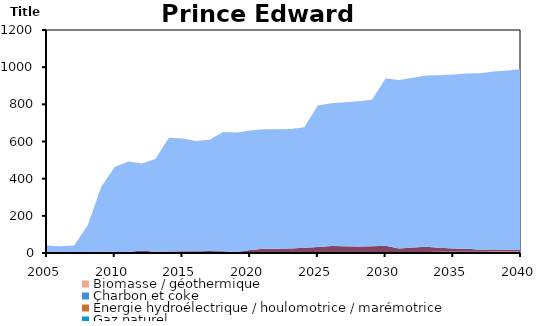
| Category | Biomasse / géothermique | Charbon et coke | Énergie hydroélectrique / houlomotrice / marémotrice | Gaz naturel | Pétrole | Solaire | Uranium | Éolien |
|---|---|---|---|---|---|---|---|---|
| 2005.0 | 0 | 0 | 0 | 0 | 0.879 | 0 | 0 | 40 |
| 2006.0 | 0 | 0 | 0 | 0 | 0.879 | 0 | 0 | 36 |
| 2007.0 | 0 | 0 | 0 | 0 | 0.879 | 0 | 0 | 40 |
| 2008.0 | 5 | 0 | 0 | 0 | 0.482 | 0 | 0 | 142 |
| 2009.0 | 5 | 0 | 0 | 0 | 2.721 | 0 | 0 | 347 |
| 2010.0 | 5 | 0 | 0 | 0 | 0 | 0 | 0 | 458 |
| 2011.0 | 5 | 0 | 0 | 0 | 0 | 0 | 0 | 488 |
| 2012.0 | 5 | 0 | 0 | 0 | 8.163 | 0 | 0 | 468 |
| 2013.0 | 5 | 0 | 0 | 0 | 2.168 | 0 | 0 | 499 |
| 2014.0 | 2.5 | 0 | 0 | 0 | 5.8 | 0 | 0 | 611.28 |
| 2015.0 | 2.6 | 0 | 0 | 0 | 7.3 | 0 | 0 | 606.094 |
| 2016.0 | 2.7 | 0 | 0 | 0 | 6.3 | 0 | 0 | 593.653 |
| 2017.0 | 2.7 | 0 | 0 | 0 | 8.1 | 0 | 0 | 598.312 |
| 2018.0 | 2.7 | 0 | 0 | 0 | 6.336 | 0 | 0 | 642.72 |
| 2019.0 | 2.7 | 0 | 0 | 0 | 3.155 | 0 | 0 | 642.72 |
| 2020.0 | 2.7 | 0 | 0 | 0 | 13.691 | 0 | 0 | 642.72 |
| 2021.0 | 2.7 | 0 | 0 | 0 | 20.118 | 0 | 0 | 642.72 |
| 2022.0 | 2.7 | 0 | 0 | 0 | 20.118 | 0 | 0 | 642.72 |
| 2023.0 | 2.7 | 0 | 0 | 0 | 22 | 0 | 0 | 642.72 |
| 2024.0 | 2.7 | 0 | 0 | 0 | 25 | 0 | 0 | 649.552 |
| 2025.0 | 2.7 | 0 | 0 | 0 | 30 | 0 | 0 | 761.33 |
| 2026.0 | 3.226 | 0 | 0 | 0 | 35 | 0 | 0 | 768.075 |
| 2027.0 | 3.751 | 0 | 0 | 0 | 33 | 0 | 0 | 774.82 |
| 2028.0 | 4.364 | 0 | 0 | 0 | 30 | 0 | 0 | 781.566 |
| 2029.0 | 4.89 | 0 | 0 | 0 | 31 | 0 | 0 | 788.398 |
| 2030.0 | 4.599 | 0 | 0 | 0 | 34 | 0 | 0 | 900.351 |
| 2031.0 | 5.027 | 0 | 0 | 0 | 19 | 0 | 0 | 907.272 |
| 2032.0 | 5.395 | 0 | 0 | 0 | 24 | 0 | 0 | 914.192 |
| 2033.0 | 5.824 | 0 | 0 | 0 | 28 | 0 | 0 | 921.288 |
| 2034.0 | 6.191 | 0 | 0 | 0 | 22 | 0 | 0 | 928.471 |
| 2035.0 | 6.191 | 0 | 0 | 0 | 18 | 0 | 0 | 935.742 |
| 2036.0 | 6.62 | 0 | 0 | 0 | 16 | 0 | 0 | 943.012 |
| 2037.0 | 7.049 | 0 | 0 | 0 | 10 | 0 | 0 | 950.458 |
| 2038.0 | 7.416 | 0 | 0 | 0 | 11 | 0 | 0 | 957.904 |
| 2039.0 | 7.845 | 0 | 0 | 0 | 9 | 0 | 0 | 965.438 |
| 2040.0 | 8.274 | 0 | 0 | 0 | 8 | 0 | 0 | 973.059 |